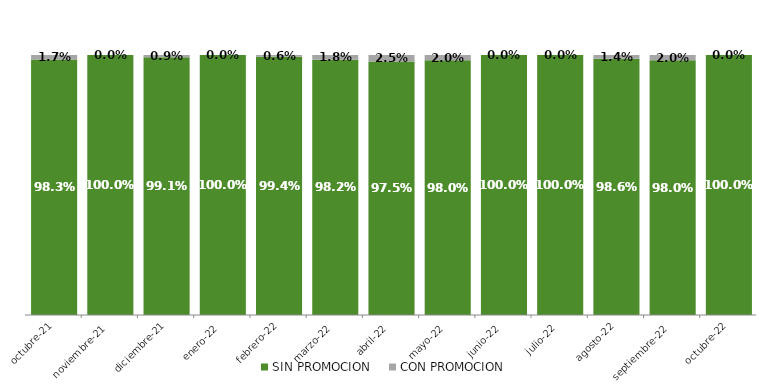
| Category | SIN PROMOCION   | CON PROMOCION   |
|---|---|---|
| 2021-10-01 | 0.983 | 0.017 |
| 2021-11-01 | 1 | 0 |
| 2021-12-01 | 0.991 | 0.009 |
| 2022-01-01 | 1 | 0 |
| 2022-02-01 | 0.994 | 0.006 |
| 2022-03-01 | 0.982 | 0.018 |
| 2022-04-01 | 0.975 | 0.025 |
| 2022-05-01 | 0.98 | 0.02 |
| 2022-06-01 | 1 | 0 |
| 2022-07-01 | 1 | 0 |
| 2022-08-01 | 0.986 | 0.014 |
| 2022-09-01 | 0.98 | 0.02 |
| 2022-10-01 | 1 | 0 |